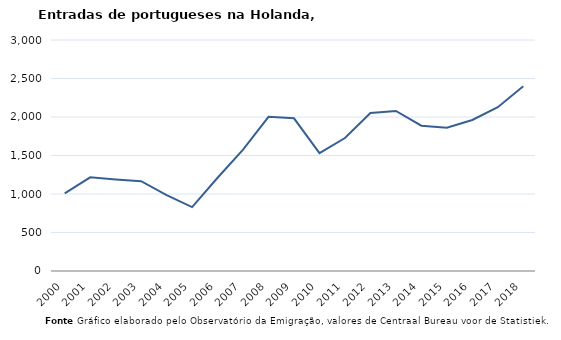
| Category | Entradas |
|---|---|
| 2000.0 | 1009 |
| 2001.0 | 1216 |
| 2002.0 | 1189 |
| 2003.0 | 1166 |
| 2004.0 | 984 |
| 2005.0 | 830 |
| 2006.0 | 1211 |
| 2007.0 | 1577 |
| 2008.0 | 2002 |
| 2009.0 | 1983 |
| 2010.0 | 1530 |
| 2011.0 | 1727 |
| 2012.0 | 2051 |
| 2013.0 | 2079 |
| 2014.0 | 1887 |
| 2015.0 | 1860 |
| 2016.0 | 1961 |
| 2017.0 | 2127 |
| 2018.0 | 2400 |